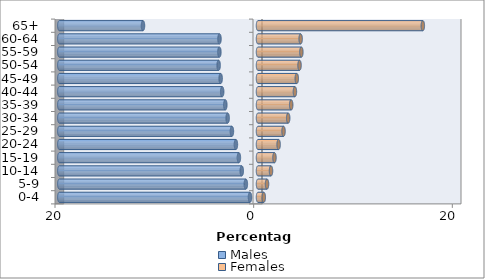
| Category | Males | Females |
|---|---|---|
| 0-4 | -0.807 | 0.581 |
| 5-9 | -1.224 | 0.909 |
| 10-14 | -1.636 | 1.308 |
| 15-19 | -1.925 | 1.657 |
| 20-24 | -2.225 | 2.075 |
| 25-29 | -2.627 | 2.57 |
| 30-34 | -3.056 | 3.039 |
| 35-39 | -3.29 | 3.342 |
| 40-44 | -3.606 | 3.715 |
| 45-49 | -3.76 | 3.904 |
| 50-54 | -3.963 | 4.182 |
| 55-59 | -3.887 | 4.366 |
| 60-64 | -3.878 | 4.293 |
| 65+ | -11.579 | 16.594 |